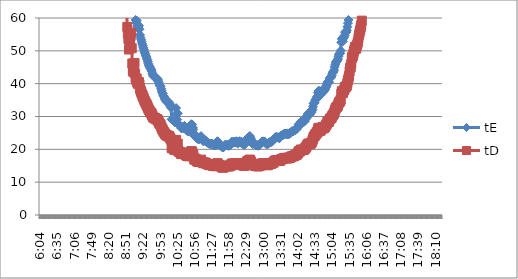
| Category | tE | tD |
|---|---|---|
| 0.25277777777777777 | 17882.69 | 12549.256 |
| 0.2534722222222222 | 17882.69 | 12549.256 |
| 0.25416666666666665 | 17882.69 | 12549.256 |
| 0.2548611111111111 | 17882.69 | 12549.256 |
| 0.2555555555555556 | 17882.69 | 12549.256 |
| 0.25625000000000003 | 17882.69 | 12549.256 |
| 0.2569444444444445 | 17882.69 | 12549.256 |
| 0.2576388888888889 | 17882.69 | 12549.256 |
| 0.25833333333333336 | 17882.69 | 12549.256 |
| 0.2590277777777778 | 17882.69 | 12549.256 |
| 0.25972222222222224 | 17882.69 | 12549.256 |
| 0.2604166666666667 | 17882.69 | 12549.256 |
| 0.2611111111111111 | 8941.345 | 6274.628 |
| 0.26180555555555557 | 8941.345 | 6274.628 |
| 0.2625 | 8941.345 | 6274.628 |
| 0.26319444444444445 | 8941.345 | 6274.628 |
| 0.2638888888888889 | 8941.345 | 6274.628 |
| 0.26458333333333334 | 8941.345 | 6274.628 |
| 0.2652777777777778 | 8941.345 | 6274.628 |
| 0.2659722222222222 | 8941.345 | 6274.628 |
| 0.26666666666666666 | 5960.897 | 4183.085 |
| 0.2673611111111111 | 5960.897 | 4183.085 |
| 0.26805555555555555 | 5960.897 | 4183.085 |
| 0.26875 | 5960.897 | 4183.085 |
| 0.26944444444444443 | 5960.897 | 4183.085 |
| 0.2701388888888889 | 4470.672 | 3137.314 |
| 0.2708333333333333 | 4470.672 | 3137.314 |
| 0.27152777777777776 | 4470.672 | 3137.314 |
| 0.2722222222222222 | 4470.672 | 3137.314 |
| 0.27291666666666664 | 4470.672 | 3137.314 |
| 0.2736111111111111 | 4470.672 | 3137.314 |
| 0.2743055555555555 | 3576.538 | 2509.851 |
| 0.27499999999999997 | 3576.538 | 2509.851 |
| 0.27569444444444446 | 3576.538 | 2509.851 |
| 0.27638888888888885 | 3576.538 | 2509.851 |
| 0.27708333333333335 | 2980.448 | 2091.543 |
| 0.2777777777777778 | 2980.448 | 2091.543 |
| 0.27847222222222223 | 2554.67 | 1792.751 |
| 0.2791666666666667 | 2554.67 | 1792.751 |
| 0.2798611111111111 | 2554.67 | 1792.751 |
| 0.28055555555555556 | 2235.336 | 1568.657 |
| 0.28125 | 2235.336 | 1568.657 |
| 0.28194444444444444 | 2235.336 | 1568.657 |
| 0.2826388888888889 | 1986.966 | 1394.362 |
| 0.2833333333333333 | 1986.966 | 1394.362 |
| 0.28402777777777777 | 1788.269 | 1254.926 |
| 0.2847222222222222 | 1788.269 | 1254.926 |
| 0.28541666666666665 | 1625.699 | 1140.841 |
| 0.28611111111111115 | 1490.224 | 1045.771 |
| 0.28680555555555554 | 1490.224 | 1045.771 |
| 0.28750000000000003 | 1375.592 | 965.327 |
| 0.2881944444444445 | 1277.335 | 896.375 |
| 0.2888888888888889 | 1192.179 | 836.617 |
| 0.28958333333333336 | 1192.179 | 836.617 |
| 0.2902777777777778 | 1117.668 | 784.328 |
| 0.29097222222222224 | 1051.923 | 738.192 |
| 0.2916666666666667 | 993.483 | 697.181 |
| 0.2923611111111111 | 941.194 | 660.487 |
| 0.29305555555555557 | 941.194 | 660.487 |
| 0.29375 | 894.134 | 627.463 |
| 0.29444444444444445 | 851.557 | 597.584 |
| 0.2951388888888889 | 812.85 | 570.421 |
| 0.29583333333333334 | 777.508 | 545.62 |
| 0.2965277777777778 | 777.508 | 545.62 |
| 0.2972222222222222 | 745.112 | 522.886 |
| 0.29791666666666666 | 715.308 | 501.97 |
| 0.2986111111111111 | 687.796 | 482.664 |
| 0.29930555555555555 | 662.322 | 464.787 |
| 0.3 | 638.667 | 448.188 |
| 0.30277777777777776 | 616.644 | 432.733 |
| 0.3055555555555555 | 596.09 | 418.309 |
| 0.30833333333333335 | 576.861 | 404.815 |
| 0.30972222222222223 | 558.834 | 392.164 |
| 0.3111111111111111 | 541.9 | 380.28 |
| 0.3125 | 510.934 | 358.55 |
| 0.31319444444444444 | 496.741 | 348.59 |
| 0.3138888888888889 | 483.316 | 339.169 |
| 0.3145833333333333 | 470.597 | 330.244 |
| 0.31527777777777777 | 458.531 | 321.776 |
| 0.3159722222222222 | 436.163 | 306.079 |
| 0.31666666666666665 | 425.778 | 298.792 |
| 0.31736111111111115 | 415.877 | 291.843 |
| 0.31805555555555554 | 397.393 | 278.872 |
| 0.31875000000000003 | 380.483 | 267.005 |
| 0.3194444444444445 | 372.556 | 261.443 |
| 0.3201388888888889 | 357.654 | 250.985 |
| 0.32083333333333336 | 357.654 | 250.985 |
| 0.3215277777777778 | 350.641 | 246.064 |
| 0.32222222222222224 | 343.898 | 241.332 |
| 0.3229166666666667 | 331.161 | 232.394 |
| 0.3236111111111111 | 319.334 | 224.094 |
| 0.32430555555555557 | 313.731 | 220.162 |
| 0.325 | 308.322 | 216.366 |
| 0.32569444444444445 | 298.045 | 209.154 |
| 0.3263888888888889 | 283.852 | 199.195 |
| 0.32708333333333334 | 279.417 | 196.082 |
| 0.3277777777777778 | 275.118 | 193.065 |
| 0.3284722222222222 | 262.981 | 184.548 |
| 0.32916666666666666 | 262.981 | 184.548 |
| 0.3298611111111111 | 255.467 | 179.275 |
| 0.33055555555555555 | 251.869 | 176.75 |
| 0.33125 | 244.968 | 171.908 |
| 0.33194444444444443 | 241.658 | 169.585 |
| 0.3326388888888889 | 241.658 | 169.585 |
| 0.3333333333333333 | 241.658 | 169.585 |
| 0.3340277777777778 | 235.299 | 165.122 |
| 0.3347222222222222 | 232.243 | 162.977 |
| 0.3354166666666667 | 229.265 | 160.888 |
| 0.3361111111111111 | 223.534 | 156.866 |
| 0.3368055555555556 | 218.082 | 153.04 |
| 0.33749999999999997 | 215.454 | 151.196 |
| 0.33819444444444446 | 207.938 | 145.922 |
| 0.33888888888888885 | 200.929 | 141.003 |
| 0.33958333333333335 | 184.358 | 129.374 |
| 0.34027777777777773 | 178.827 | 125.493 |
| 0.34097222222222223 | 178.827 | 125.493 |
| 0.3416666666666666 | 170.311 | 119.517 |
| 0.3423611111111111 | 164.061 | 115.131 |
| 0.3430555555555555 | 170.311 | 119.517 |
| 0.34375 | 168.705 | 118.389 |
| 0.3444444444444445 | 167.128 | 117.283 |
| 0.3451388888888889 | 152.844 | 107.259 |
| 0.3458333333333334 | 159.667 | 112.047 |
| 0.34652777777777777 | 159.667 | 112.047 |
| 0.34722222222222227 | 159.667 | 112.047 |
| 0.34791666666666665 | 156.866 | 110.081 |
| 0.34861111111111115 | 154.161 | 108.183 |
| 0.34930555555555554 | 151.548 | 106.35 |
| 0.35000000000000003 | 147.791 | 103.713 |
| 0.3506944444444444 | 137.559 | 96.533 |
| 0.3513888888888889 | 129.585 | 90.937 |
| 0.3520833333333333 | 126.828 | 89.002 |
| 0.3527777777777778 | 133.453 | 93.651 |
| 0.3534722222222222 | 130.531 | 91.6 |
| 0.3541666666666667 | 135.475 | 95.07 |
| 0.3548611111111111 | 135.475 | 95.07 |
| 0.35555555555555557 | 132.464 | 92.957 |
| 0.35625 | 129.585 | 90.937 |
| 0.35694444444444445 | 123.329 | 86.547 |
| 0.3576388888888889 | 115.372 | 80.963 |
| 0.35833333333333334 | 114.633 | 80.444 |
| 0.3590277777777778 | 109.71 | 76.989 |
| 0.3597222222222222 | 103.969 | 72.961 |
| 0.36041666666666666 | 99.903 | 70.108 |
| 0.3611111111111111 | 97.72 | 68.575 |
| 0.36180555555555555 | 98.799 | 69.333 |
| 0.3625 | 95.121 | 66.751 |
| 0.36319444444444443 | 98.257 | 68.952 |
| 0.3638888888888889 | 98.799 | 69.333 |
| 0.3645833333333333 | 98.799 | 69.333 |
| 0.3652777777777778 | 98.799 | 69.333 |
| 0.3659722222222222 | 99.903 | 70.108 |
| 0.3666666666666667 | 97.72 | 68.575 |
| 0.3673611111111111 | 94.617 | 66.398 |
| 0.3680555555555556 | 90.317 | 63.38 |
| 0.36874999999999997 | 88.969 | 62.434 |
| 0.36944444444444446 | 86.39 | 60.624 |
| 0.37013888888888885 | 81.656 | 57.303 |
| 0.37083333333333335 | 78.778 | 55.283 |
| 0.37152777777777773 | 76.422 | 53.629 |
| 0.37222222222222223 | 71.818 | 50.399 |
| 0.3729166666666666 | 74.823 | 52.507 |
| 0.3736111111111111 | 74.511 | 52.289 |
| 0.3743055555555555 | 77.751 | 54.562 |
| 0.375 | 79.127 | 55.528 |
| 0.3756944444444445 | 72.4 | 50.807 |
| 0.3763888888888889 | 65.745 | 46.137 |
| 0.3770833333333334 | 62.527 | 43.879 |
| 0.37777777777777777 | 62.093 | 43.574 |
| 0.37847222222222227 | 62.309 | 43.726 |
| 0.37916666666666665 | 65.988 | 46.307 |
| 0.37986111111111115 | 61.453 | 43.125 |
| 0.38055555555555554 | 59.411 | 41.692 |
| 0.38125000000000003 | 58.632 | 41.145 |
| 0.3819444444444444 | 59.214 | 41.554 |
| 0.3826388888888889 | 57.501 | 40.351 |
| 0.3833333333333333 | 56.951 | 39.966 |
| 0.3840277777777778 | 57.316 | 40.222 |
| 0.3847222222222222 | 57.686 | 40.481 |
| 0.3854166666666667 | 56.591 | 39.713 |
| 0.3861111111111111 | 54.855 | 38.495 |
| 0.38680555555555557 | 54.026 | 37.913 |
| 0.3875 | 53.381 | 37.46 |
| 0.38819444444444445 | 52.751 | 37.018 |
| 0.3888888888888889 | 52.136 | 36.587 |
| 0.38958333333333334 | 51.535 | 36.165 |
| 0.3902777777777778 | 50.948 | 35.753 |
| 0.3909722222222222 | 50.374 | 35.35 |
| 0.39166666666666666 | 49.674 | 34.859 |
| 0.3923611111111111 | 49.264 | 34.571 |
| 0.39305555555555555 | 48.727 | 34.194 |
| 0.39375 | 48.332 | 33.917 |
| 0.39444444444444443 | 47.815 | 33.554 |
| 0.3951388888888889 | 47.309 | 33.199 |
| 0.3958333333333333 | 46.691 | 32.766 |
| 0.3965277777777778 | 46.089 | 32.343 |
| 0.3972222222222222 | 45.619 | 32.013 |
| 0.3979166666666667 | 45.273 | 31.77 |
| 0.3986111111111111 | 44.819 | 31.452 |
| 0.3993055555555556 | 44.595 | 31.295 |
| 0.39999999999999997 | 44.264 | 31.063 |
| 0.40069444444444446 | 43.83 | 30.758 |
| 0.40138888888888885 | 43.195 | 30.312 |
| 0.40208333333333335 | 42.679 | 29.95 |
| 0.40277777777777773 | 42.276 | 29.667 |
| 0.40347222222222223 | 42.276 | 29.667 |
| 0.4041666666666666 | 42.077 | 29.528 |
| 0.4048611111111111 | 41.88 | 29.389 |
| 0.4055555555555555 | 41.978 | 29.458 |
| 0.40625 | 41.491 | 29.117 |
| 0.4069444444444445 | 41.588 | 29.184 |
| 0.4076388888888889 | 41.588 | 29.184 |
| 0.4083333333333334 | 41.204 | 28.915 |
| 0.40902777777777777 | 40.735 | 28.586 |
| 0.40972222222222227 | 40.186 | 28.201 |
| 0.41041666666666665 | 39.563 | 27.764 |
| 0.41111111111111115 | 39.389 | 27.642 |
| 0.41180555555555554 | 39.216 | 27.52 |
| 0.41250000000000003 | 38.457 | 26.988 |
| 0.4131944444444444 | 37.807 | 26.531 |
| 0.4138888888888889 | 37.256 | 26.144 |
| 0.4145833333333333 | 36.948 | 25.928 |
| 0.4152777777777778 | 36.347 | 25.507 |
| 0.4159722222222222 | 36.054 | 25.301 |
| 0.4173611111111111 | 35.623 | 24.999 |
| 0.41805555555555557 | 35.272 | 24.752 |
| 0.41875 | 34.995 | 24.558 |
| 0.41944444444444445 | 34.724 | 24.367 |
| 0.4201388888888889 | 34.523 | 24.226 |
| 0.42083333333333334 | 34.523 | 24.226 |
| 0.4215277777777778 | 34.193 | 23.995 |
| 0.4222222222222222 | 34.193 | 23.995 |
| 0.42291666666666666 | 34.39 | 24.133 |
| 0.4236111111111111 | 33.998 | 23.858 |
| 0.42430555555555555 | 33.551 | 23.545 |
| 0.425 | 33.055 | 23.196 |
| 0.42569444444444443 | 32.633 | 22.9 |
| 0.4263888888888889 | 29.125 | 20.439 |
| 0.4270833333333333 | 29.03 | 20.372 |
| 0.4277777777777778 | 29.316 | 20.573 |
| 0.4284722222222222 | 28.89 | 20.273 |
| 0.4291666666666667 | 28.521 | 20.015 |
| 0.4298611111111111 | 28.43 | 19.951 |
| 0.4305555555555556 | 28.206 | 19.794 |
| 0.43124999999999997 | 28.983 | 20.339 |
| 0.43194444444444446 | 32.573 | 22.858 |
| 0.43263888888888885 | 30.939 | 21.712 |
| 0.43333333333333335 | 29.078 | 20.405 |
| 0.43402777777777773 | 30.939 | 21.712 |
| 0.43472222222222223 | 27.725 | 19.456 |
| 0.4354166666666666 | 27.554 | 19.336 |
| 0.4361111111111111 | 27.344 | 19.188 |
| 0.4368055555555555 | 27.177 | 19.072 |
| 0.4375 | 27.136 | 19.043 |
| 0.4381944444444445 | 26.532 | 18.619 |
| 0.4388888888888889 | 26.415 | 18.537 |
| 0.4395833333333334 | 26.493 | 18.591 |
| 0.44027777777777777 | 26.811 | 18.814 |
| 0.44097222222222227 | 26.493 | 18.591 |
| 0.44166666666666665 | 26.493 | 18.591 |
| 0.44236111111111115 | 27.136 | 19.043 |
| 0.44305555555555554 | 26.337 | 18.482 |
| 0.44375000000000003 | 26.376 | 18.509 |
| 0.4444444444444444 | 25.992 | 18.24 |
| 0.4451388888888889 | 25.805 | 18.109 |
| 0.4458333333333333 | 25.62 | 17.979 |
| 0.4465277777777778 | 25.62 | 17.979 |
| 0.4472222222222222 | 25.547 | 17.928 |
| 0.4479166666666667 | 25.547 | 17.928 |
| 0.4486111111111111 | 25.547 | 17.928 |
| 0.44930555555555557 | 26.183 | 18.374 |
| 0.45 | 26.972 | 18.928 |
| 0.45069444444444445 | 27.597 | 19.366 |
| 0.4513888888888889 | 27.639 | 19.396 |
| 0.45208333333333334 | 27.554 | 19.336 |
| 0.4527777777777778 | 26.651 | 18.702 |
| 0.4534722222222222 | 26.068 | 18.293 |
| 0.45416666666666666 | 24.872 | 17.454 |
| 0.4548611111111111 | 24.101 | 16.913 |
| 0.45555555555555555 | 24.068 | 16.89 |
| 0.45625 | 24.363 | 17.097 |
| 0.45694444444444443 | 24.133 | 16.936 |
| 0.4576388888888889 | 23.437 | 16.447 |
| 0.4583333333333333 | 23.315 | 16.361 |
| 0.4590277777777778 | 23.254 | 16.319 |
| 0.4597222222222222 | 23.074 | 16.193 |
| 0.4604166666666667 | 23.015 | 16.151 |
| 0.4611111111111111 | 23.194 | 16.277 |
| 0.4618055555555556 | 23.407 | 16.426 |
| 0.46249999999999997 | 23.686 | 16.622 |
| 0.46319444444444446 | 24.036 | 16.867 |
| 0.46388888888888885 | 23.194 | 16.277 |
| 0.46458333333333335 | 22.897 | 16.068 |
| 0.46527777777777773 | 22.868 | 16.048 |
| 0.46597222222222223 | 22.494 | 15.785 |
| 0.4666666666666666 | 22.466 | 15.765 |
| 0.4673611111111111 | 22.752 | 15.966 |
| 0.4680555555555555 | 22.752 | 15.966 |
| 0.46875 | 22.665 | 15.905 |
| 0.4694444444444445 | 22.551 | 15.825 |
| 0.4701388888888889 | 22.325 | 15.667 |
| 0.4708333333333334 | 22.132 | 15.531 |
| 0.47152777777777777 | 21.996 | 15.436 |
| 0.47222222222222227 | 21.942 | 15.398 |
| 0.47291666666666665 | 21.861 | 15.341 |
| 0.47361111111111115 | 21.702 | 15.23 |
| 0.47430555555555554 | 21.65 | 15.193 |
| 0.47500000000000003 | 21.65 | 15.193 |
| 0.4756944444444444 | 21.65 | 15.193 |
| 0.4763888888888889 | 21.676 | 15.211 |
| 0.4770833333333333 | 21.755 | 15.267 |
| 0.4777777777777778 | 21.571 | 15.138 |
| 0.4784722222222222 | 21.264 | 14.922 |
| 0.4791666666666667 | 21.34 | 14.975 |
| 0.4798611111111111 | 21.264 | 14.922 |
| 0.48055555555555557 | 21.213 | 14.886 |
| 0.48125 | 21.188 | 14.869 |
| 0.48194444444444445 | 21.264 | 14.922 |
| 0.4826388888888889 | 21.729 | 15.248 |
| 0.48333333333333334 | 22.381 | 15.706 |
| 0.4840277777777778 | 22.466 | 15.765 |
| 0.4847222222222222 | 21.861 | 15.341 |
| 0.48541666666666666 | 21.519 | 15.101 |
| 0.4861111111111111 | 21.519 | 15.101 |
| 0.48680555555555555 | 21.264 | 14.922 |
| 0.4875 | 21.365 | 14.993 |
| 0.48819444444444443 | 21.063 | 14.781 |
| 0.4888888888888889 | 21.038 | 14.764 |
| 0.4895833333333333 | 20.746 | 14.558 |
| 0.4902777777777778 | 20.578 | 14.441 |
| 0.4909722222222222 | 20.578 | 14.441 |
| 0.4916666666666667 | 20.722 | 14.541 |
| 0.4923611111111111 | 21.014 | 14.746 |
| 0.4930555555555556 | 21.34 | 14.975 |
| 0.49374999999999997 | 21.314 | 14.957 |
| 0.49444444444444446 | 21.289 | 14.94 |
| 0.49513888888888885 | 21.188 | 14.869 |
| 0.49583333333333335 | 21.238 | 14.904 |
| 0.49652777777777773 | 21.468 | 15.065 |
| 0.49722222222222223 | 21.163 | 14.851 |
| 0.4979166666666666 | 21.063 | 14.781 |
| 0.4986111111111111 | 21.188 | 14.869 |
| 0.4993055555555555 | 21.314 | 14.957 |
| 0.5 | 21.34 | 14.975 |
| 0.5006944444444444 | 21.755 | 15.267 |
| 0.5013888888888889 | 22.27 | 15.628 |
| 0.5020833333333333 | 22.187 | 15.57 |
| 0.5027777777777778 | 21.835 | 15.323 |
| 0.5034722222222222 | 22.27 | 15.628 |
| 0.5041666666666667 | 22.381 | 15.706 |
| 0.5048611111111111 | 22.077 | 15.493 |
| 0.5055555555555555 | 22.242 | 15.609 |
| 0.50625 | 22.132 | 15.531 |
| 0.5069444444444444 | 22.215 | 15.589 |
| 0.5076388888888889 | 22.466 | 15.765 |
| 0.5083333333333333 | 22.215 | 15.589 |
| 0.5090277777777777 | 21.808 | 15.304 |
| 0.5097222222222222 | 21.888 | 15.36 |
| 0.5104166666666666 | 22.242 | 15.609 |
| 0.5111111111111112 | 22.215 | 15.589 |
| 0.5118055555555555 | 22.494 | 15.785 |
| 0.5125000000000001 | 22.077 | 15.493 |
| 0.5131944444444444 | 22.023 | 15.455 |
| 0.513888888888889 | 22.215 | 15.589 |
| 0.5145833333333333 | 22.159 | 15.551 |
| 0.5152777777777778 | 21.996 | 15.436 |
| 0.5159722222222222 | 21.545 | 15.12 |
| 0.5166666666666667 | 21.442 | 15.047 |
| 0.517361111111111 | 21.365 | 14.993 |
| 0.5180555555555556 | 21.519 | 15.101 |
| 0.5187499999999999 | 21.915 | 15.379 |
| 0.5194444444444445 | 22.27 | 15.628 |
| 0.5201388888888888 | 22.608 | 15.865 |
| 0.5208333333333334 | 23.285 | 16.34 |
| 0.5215277777777778 | 23.224 | 16.298 |
| 0.5222222222222223 | 23.254 | 16.319 |
| 0.5229166666666667 | 23.686 | 16.622 |
| 0.5236111111111111 | 23.686 | 16.622 |
| 0.5243055555555556 | 24.068 | 16.89 |
| 0.525 | 23.623 | 16.578 |
| 0.5256944444444445 | 23.104 | 16.214 |
| 0.5263888888888889 | 22.723 | 15.946 |
| 0.5270833333333333 | 22.132 | 15.531 |
| 0.5277777777777778 | 21.624 | 15.174 |
| 0.5284722222222222 | 21.755 | 15.267 |
| 0.5291666666666667 | 22.023 | 15.455 |
| 0.5298611111111111 | 21.915 | 15.379 |
| 0.5305555555555556 | 21.494 | 15.083 |
| 0.53125 | 21.314 | 14.957 |
| 0.5319444444444444 | 21.264 | 14.922 |
| 0.5326388888888889 | 21.365 | 14.993 |
| 0.5333333333333333 | 21.213 | 14.886 |
| 0.5340277777777778 | 21.238 | 14.904 |
| 0.5347222222222222 | 21.088 | 14.799 |
| 0.5354166666666667 | 21.213 | 14.886 |
| 0.5361111111111111 | 21.365 | 14.993 |
| 0.5368055555555555 | 21.365 | 14.993 |
| 0.5375 | 21.597 | 15.156 |
| 0.5381944444444444 | 21.729 | 15.248 |
| 0.5388888888888889 | 22.187 | 15.57 |
| 0.5395833333333333 | 22.298 | 15.647 |
| 0.5402777777777777 | 22.353 | 15.687 |
| 0.5409722222222222 | 22.409 | 15.726 |
| 0.5416666666666666 | 22.438 | 15.746 |
| 0.5423611111111112 | 22.27 | 15.628 |
| 0.5430555555555555 | 22.325 | 15.667 |
| 0.5437500000000001 | 22.023 | 15.455 |
| 0.5444444444444444 | 21.729 | 15.248 |
| 0.545138888888889 | 21.702 | 15.23 |
| 0.5458333333333333 | 21.624 | 15.174 |
| 0.5465277777777778 | 21.65 | 15.193 |
| 0.5472222222222222 | 21.676 | 15.211 |
| 0.5479166666666667 | 21.861 | 15.341 |
| 0.548611111111111 | 22.105 | 15.512 |
| 0.5493055555555556 | 22.187 | 15.57 |
| 0.5499999999999999 | 22.132 | 15.531 |
| 0.5506944444444445 | 22.159 | 15.551 |
| 0.5513888888888888 | 22.298 | 15.647 |
| 0.5520833333333334 | 22.494 | 15.785 |
| 0.5527777777777778 | 22.551 | 15.825 |
| 0.5534722222222223 | 22.636 | 15.885 |
| 0.5541666666666667 | 23.074 | 16.193 |
| 0.5548611111111111 | 23.254 | 16.319 |
| 0.5555555555555556 | 23.376 | 16.404 |
| 0.55625 | 23.654 | 16.6 |
| 0.5569444444444445 | 23.654 | 16.6 |
| 0.5576388888888889 | 23.812 | 16.71 |
| 0.5583333333333333 | 23.654 | 16.6 |
| 0.5590277777777778 | 23.654 | 16.6 |
| 0.5597222222222222 | 23.654 | 16.6 |
| 0.5604166666666667 | 23.499 | 16.49 |
| 0.5611111111111111 | 23.437 | 16.447 |
| 0.5618055555555556 | 23.468 | 16.469 |
| 0.5625 | 23.749 | 16.666 |
| 0.5631944444444444 | 24.068 | 16.89 |
| 0.5638888888888889 | 24.231 | 17.004 |
| 0.5645833333333333 | 24.231 | 17.004 |
| 0.5652777777777778 | 24.33 | 17.074 |
| 0.5659722222222222 | 24.363 | 17.097 |
| 0.5666666666666667 | 24.564 | 17.238 |
| 0.5673611111111111 | 24.734 | 17.357 |
| 0.5680555555555555 | 24.734 | 17.357 |
| 0.56875 | 24.803 | 17.405 |
| 0.5694444444444444 | 24.7 | 17.333 |
| 0.5701388888888889 | 24.598 | 17.262 |
| 0.5708333333333333 | 24.632 | 17.285 |
| 0.5715277777777777 | 24.872 | 17.454 |
| 0.5722222222222222 | 24.598 | 17.262 |
| 0.5729166666666666 | 24.734 | 17.357 |
| 0.5736111111111112 | 24.666 | 17.309 |
| 0.5743055555555555 | 24.941 | 17.502 |
| 0.5750000000000001 | 25.046 | 17.576 |
| 0.5756944444444444 | 25.011 | 17.551 |
| 0.576388888888889 | 25.294 | 17.75 |
| 0.5770833333333333 | 25.51 | 17.902 |
| 0.5777777777777778 | 25.51 | 17.902 |
| 0.5784722222222222 | 25.474 | 17.876 |
| 0.5791666666666667 | 25.547 | 17.928 |
| 0.579861111111111 | 25.694 | 18.031 |
| 0.5805555555555556 | 25.842 | 18.135 |
| 0.5812499999999999 | 25.955 | 18.214 |
| 0.5819444444444445 | 26.03 | 18.267 |
| 0.5826388888888888 | 26.259 | 18.428 |
| 0.5833333333333334 | 26.221 | 18.401 |
| 0.5840277777777778 | 26.651 | 18.702 |
| 0.5847222222222223 | 26.811 | 18.814 |
| 0.5854166666666667 | 27.512 | 19.307 |
| 0.5861111111111111 | 27.725 | 19.456 |
| 0.5868055555555556 | 27.554 | 19.336 |
| 0.5875 | 27.725 | 19.456 |
| 0.5881944444444445 | 28.43 | 19.951 |
| 0.5888888888888889 | 28.206 | 19.794 |
| 0.5895833333333333 | 28.206 | 19.794 |
| 0.5902777777777778 | 28.251 | 19.825 |
| 0.5909722222222222 | 28.34 | 19.888 |
| 0.5916666666666667 | 28.34 | 19.888 |
| 0.5923611111111111 | 28.43 | 19.951 |
| 0.5930555555555556 | 28.567 | 20.047 |
| 0.59375 | 29.03 | 20.372 |
| 0.5944444444444444 | 29.268 | 20.539 |
| 0.5951388888888889 | 29.607 | 20.777 |
| 0.5958333333333333 | 30.156 | 21.162 |
| 0.5965277777777778 | 30.413 | 21.342 |
| 0.5972222222222222 | 30.832 | 21.637 |
| 0.5979166666666667 | 30.993 | 21.749 |
| 0.5986111111111111 | 30.939 | 21.712 |
| 0.5993055555555555 | 30.674 | 21.525 |
| 0.6 | 30.779 | 21.599 |
| 0.6006944444444444 | 31.1 | 21.825 |
| 0.6013888888888889 | 31.263 | 21.939 |
| 0.6020833333333333 | 31.707 | 22.25 |
| 0.6027777777777777 | 32.163 | 22.571 |
| 0.6034722222222222 | 32.994 | 23.154 |
| 0.6041666666666666 | 33.933 | 23.813 |
| 0.6048611111111112 | 34.062 | 23.903 |
| 0.6055555555555555 | 34.324 | 24.087 |
| 0.6062500000000001 | 34.995 | 24.558 |
| 0.6069444444444444 | 35.064 | 24.606 |
| 0.607638888888889 | 35.411 | 24.85 |
| 0.6083333333333333 | 36.054 | 25.301 |
| 0.6090277777777778 | 35.765 | 25.099 |
| 0.6097222222222222 | 37.256 | 26.144 |
| 0.6104166666666667 | 37.807 | 26.531 |
| 0.611111111111111 | 37.807 | 26.531 |
| 0.6118055555555556 | 37.333 | 26.199 |
| 0.6124999999999999 | 36.495 | 25.611 |
| 0.6131944444444445 | 36.796 | 25.822 |
| 0.6138888888888888 | 37.333 | 26.199 |
| 0.6145833333333334 | 37.727 | 26.475 |
| 0.6152777777777778 | 38.129 | 26.757 |
| 0.6159722222222223 | 37.807 | 26.531 |
| 0.6166666666666667 | 37.569 | 26.364 |
| 0.6173611111111111 | 37.887 | 26.587 |
| 0.6180555555555556 | 38.048 | 26.701 |
| 0.61875 | 38.293 | 26.872 |
| 0.6194444444444445 | 38.875 | 27.281 |
| 0.6201388888888889 | 39.131 | 27.46 |
| 0.6208333333333333 | 39.651 | 27.825 |
| 0.6215277777777778 | 40.459 | 28.392 |
| 0.6222222222222222 | 40.367 | 28.328 |
| 0.6229166666666667 | 40.367 | 28.328 |
| 0.6236111111111111 | 40.55 | 28.456 |
| 0.6243055555555556 | 41.491 | 29.117 |
| 0.625 | 41.88 | 29.389 |
| 0.6256944444444444 | 41.88 | 29.389 |
| 0.6263888888888889 | 42.077 | 29.528 |
| 0.6270833333333333 | 42.578 | 29.879 |
| 0.6277777777777778 | 43.195 | 30.312 |
| 0.6284722222222222 | 43.51 | 30.533 |
| 0.6291666666666667 | 43.616 | 30.608 |
| 0.6298611111111111 | 44.155 | 30.986 |
| 0.6305555555555555 | 45.045 | 31.61 |
| 0.63125 | 45.736 | 32.095 |
| 0.6319444444444444 | 46.328 | 32.511 |
| 0.6326388888888889 | 46.691 | 32.766 |
| 0.6333333333333333 | 46.936 | 32.938 |
| 0.6340277777777777 | 47.06 | 33.024 |
| 0.6347222222222222 | 47.56 | 33.376 |
| 0.6354166666666666 | 48.332 | 33.917 |
| 0.6361111111111112 | 48.86 | 34.288 |
| 0.6368055555555555 | 49.264 | 34.571 |
| 0.6375000000000001 | 49.264 | 34.571 |
| 0.6381944444444444 | 50.092 | 35.152 |
| 0.638888888888889 | 52.596 | 36.91 |
| 0.6395833333333333 | 53.702 | 37.685 |
| 0.6402777777777778 | 53.381 | 37.46 |
| 0.6409722222222222 | 52.907 | 37.128 |
| 0.6416666666666667 | 53.864 | 37.799 |
| 0.642361111111111 | 54.19 | 38.028 |
| 0.6430555555555556 | 54.687 | 38.377 |
| 0.6437499999999999 | 55.709 | 39.094 |
| 0.6444444444444445 | 55.536 | 38.973 |
| 0.6451388888888888 | 55.709 | 39.094 |
| 0.6458333333333334 | 56.235 | 39.463 |
| 0.6465277777777778 | 57.316 | 40.222 |
| 0.6472222222222223 | 58.44 | 41.011 |
| 0.6479166666666667 | 59.411 | 41.692 |
| 0.6486111111111111 | 60.414 | 42.396 |
| 0.6493055555555556 | 62.309 | 43.726 |
| 0.65 | 63.867 | 44.819 |
| 0.6506944444444445 | 64.096 | 44.979 |
| 0.6513888888888889 | 65.504 | 45.968 |
| 0.6520833333333333 | 67.995 | 47.716 |
| 0.6527777777777778 | 68.78 | 48.266 |
| 0.6534722222222222 | 69.045 | 48.453 |
| 0.6541666666666667 | 70.128 | 49.213 |
| 0.6548611111111111 | 71.246 | 49.997 |
| 0.6555555555555556 | 72.108 | 50.602 |
| 0.65625 | 72.991 | 51.221 |
| 0.6569444444444444 | 72.108 | 50.602 |
| 0.6576388888888889 | 72.4 | 50.807 |
| 0.6583333333333333 | 73.591 | 51.643 |
| 0.6590277777777778 | 74.202 | 52.072 |
| 0.6597222222222222 | 75.137 | 52.728 |
| 0.6604166666666667 | 76.75 | 53.859 |
| 0.6611111111111111 | 78.09 | 54.8 |
| 0.6618055555555555 | 79.127 | 55.528 |
| 0.6625 | 80.191 | 56.275 |
| 0.6631944444444444 | 81.285 | 57.042 |
| 0.6638888888888889 | 82.409 | 57.831 |
| 0.6645833333333333 | 84.352 | 59.195 |
| 0.6652777777777777 | 85.974 | 60.333 |
| 0.6659722222222222 | 87.233 | 61.216 |
| 0.6666666666666666 | 88.092 | 61.819 |
| 0.6673611111111111 | 89.863 | 63.062 |
| 0.6680555555555556 | 92.656 | 65.022 |
| 0.6687500000000001 | 95.121 | 66.751 |
| 0.6694444444444444 | 96.663 | 67.834 |
| 0.6701388888888888 | 98.257 | 68.952 |
| 0.6708333333333334 | 99.903 | 70.108 |
| 0.6715277777777778 | 102.774 | 72.122 |
| 0.6722222222222222 | 103.969 | 72.961 |
| 0.6729166666666666 | 106.445 | 74.698 |
| 0.6736111111111112 | 109.71 | 76.989 |
| 0.6743055555555556 | 112.47 | 78.926 |
| 0.6749999999999999 | 115.372 | 80.963 |
| 0.6756944444444444 | 118.428 | 83.108 |
| 0.6763888888888889 | 123.329 | 86.547 |
| 0.6770833333333334 | 127.733 | 89.638 |
| 0.6777777777777777 | 129.585 | 90.937 |
| 0.6784722222222223 | 132.464 | 92.957 |
| 0.6791666666666667 | 134.456 | 94.355 |
| 0.6798611111111111 | 138.626 | 97.281 |
| 0.6805555555555555 | 141.926 | 99.597 |
| 0.68125 | 145.388 | 102.026 |
| 0.6819444444444445 | 151.548 | 106.35 |
| 0.6826388888888889 | 154.161 | 108.183 |
| 0.6833333333333332 | 155.502 | 109.124 |
| 0.6840277777777778 | 158.254 | 111.055 |
| 0.6847222222222222 | 162.57 | 114.084 |
| 0.6854166666666667 | 168.705 | 118.389 |
| 0.686111111111111 | 171.949 | 120.666 |
| 0.6868055555555556 | 175.32 | 123.032 |
| 0.6875 | 178.827 | 125.493 |
| 0.6881944444444444 | 182.476 | 128.054 |
| 0.688888888888889 | 188.239 | 132.097 |
| 0.6895833333333333 | 192.287 | 134.938 |
| 0.6902777777777778 | 196.513 | 137.904 |
| 0.6909722222222222 | 200.929 | 141.003 |
| 0.6916666666666668 | 205.548 | 144.244 |
| 0.6923611111111111 | 210.385 | 147.638 |
| 0.6930555555555555 | 215.454 | 151.196 |
| 0.69375 | 220.774 | 154.929 |
| 0.6944444444444445 | 226.363 | 158.851 |
| 0.6951388888888889 | 232.243 | 162.977 |
| 0.6958333333333333 | 238.436 | 167.323 |
| 0.6965277777777777 | 244.968 | 171.908 |
| 0.6972222222222223 | 248.371 | 174.295 |
| 0.6979166666666666 | 255.467 | 179.275 |
| 0.6986111111111111 | 262.981 | 184.548 |
| 0.6993055555555556 | 266.906 | 187.302 |
| 0.7000000000000001 | 270.95 | 190.14 |
| 0.7006944444444444 | 279.417 | 196.082 |
| 0.7013888888888888 | 283.852 | 199.195 |
| 0.7020833333333334 | 288.43 | 202.407 |
| 0.7027777777777778 | 293.159 | 205.726 |
| 0.7034722222222222 | 303.096 | 212.699 |
| 0.7041666666666666 | 308.322 | 216.366 |
| 0.7048611111111112 | 313.731 | 220.162 |
| 0.7055555555555556 | 325.14 | 228.168 |
| 0.7062499999999999 | 331.161 | 232.394 |
| 0.7069444444444444 | 337.409 | 236.778 |
| 0.7076388888888889 | 350.641 | 246.064 |
| 0.7083333333333334 | 357.654 | 250.985 |
| 0.7090277777777777 | 364.953 | 256.107 |
| 0.7097222222222223 | 380.483 | 267.005 |
| 0.7104166666666667 | 388.754 | 272.81 |
| 0.7111111111111111 | 397.393 | 278.872 |
| 0.7118055555555555 | 406.425 | 285.21 |
| 0.7125 | 415.877 | 291.843 |
| 0.7131944444444445 | 425.778 | 298.792 |
| 0.7138888888888889 | 436.163 | 306.079 |
| 0.7145833333333332 | 447.067 | 313.731 |
| 0.7152777777777778 | 470.597 | 330.244 |
| 0.7159722222222222 | 483.316 | 339.169 |
| 0.7166666666666667 | 496.741 | 348.59 |
| 0.717361111111111 | 510.934 | 358.55 |
| 0.7180555555555556 | 525.961 | 369.096 |
| 0.71875 | 541.9 | 380.28 |
| 0.7194444444444444 | 558.834 | 392.164 |
| 0.720138888888889 | 596.09 | 418.309 |
| 0.7208333333333333 | 616.644 | 432.733 |
| 0.7215277777777778 | 638.667 | 448.188 |
| 0.7222222222222222 | 662.322 | 464.787 |
| 0.7229166666666668 | 687.796 | 482.664 |
| 0.7236111111111111 | 715.308 | 501.97 |
| 0.7243055555555555 | 745.112 | 522.886 |
| 0.725 | 777.508 | 545.62 |
| 0.7256944444444445 | 812.85 | 570.421 |
| 0.7263888888888889 | 851.557 | 597.584 |
| 0.7270833333333333 | 851.557 | 597.584 |
| 0.7277777777777777 | 894.134 | 627.463 |
| 0.7284722222222223 | 941.194 | 660.487 |
| 0.7291666666666666 | 993.483 | 697.181 |
| 0.7298611111111111 | 1051.923 | 738.192 |
| 0.7305555555555556 | 1051.923 | 738.192 |
| 0.7312500000000001 | 1117.668 | 784.328 |
| 0.7319444444444444 | 1192.179 | 836.617 |
| 0.7326388888888888 | 1277.335 | 896.375 |
| 0.7333333333333334 | 1277.335 | 896.375 |
| 0.7340277777777778 | 1375.592 | 965.327 |
| 0.7347222222222222 | 1490.224 | 1045.771 |
| 0.7354166666666666 | 1490.224 | 1045.771 |
| 0.7361111111111112 | 1625.699 | 1140.841 |
| 0.7368055555555556 | 1625.699 | 1140.841 |
| 0.7374999999999999 | 1788.269 | 1254.926 |
| 0.7381944444444444 | 1788.269 | 1254.926 |
| 0.7388888888888889 | 1986.966 | 1394.362 |
| 0.7395833333333334 | 1986.966 | 1394.362 |
| 0.7402777777777777 | 2235.336 | 1568.657 |
| 0.7409722222222223 | 2235.336 | 1568.657 |
| 0.7416666666666667 | 2554.67 | 1792.751 |
| 0.7423611111111111 | 2554.67 | 1792.751 |
| 0.7430555555555555 | 2554.67 | 1792.751 |
| 0.74375 | 2980.448 | 2091.543 |
| 0.7444444444444445 | 2980.448 | 2091.543 |
| 0.7451388888888889 | 2980.448 | 2091.543 |
| 0.7458333333333332 | 3576.538 | 2509.851 |
| 0.7465277777777778 | 3576.538 | 2509.851 |
| 0.7472222222222222 | 3576.538 | 2509.851 |
| 0.7479166666666667 | 3576.538 | 2509.851 |
| 0.748611111111111 | 4470.672 | 3137.314 |
| 0.7493055555555556 | 4470.672 | 3137.314 |
| 0.75 | 4470.672 | 3137.314 |
| 0.7506944444444444 | 5960.897 | 4183.085 |
| 0.751388888888889 | 5960.897 | 4183.085 |
| 0.7520833333333333 | 5960.897 | 4183.085 |
| 0.7527777777777778 | 5960.897 | 4183.085 |
| 0.7534722222222222 | 5960.897 | 4183.085 |
| 0.7541666666666668 | 8941.345 | 6274.628 |
| 0.7548611111111111 | 8941.345 | 6274.628 |
| 0.7555555555555555 | 8941.345 | 6274.628 |
| 0.75625 | 8941.345 | 6274.628 |
| 0.7569444444444445 | 8941.345 | 6274.628 |
| 0.7576388888888889 | 8941.345 | 6274.628 |
| 0.7583333333333333 | 8941.345 | 6274.628 |
| 0.7590277777777777 | 17882.69 | 12549.256 |
| 0.7597222222222223 | 17882.69 | 12549.256 |
| 0.7604166666666666 | 17882.69 | 12549.256 |
| 0.7611111111111111 | 17882.69 | 12549.256 |
| 0.7618055555555556 | 17882.69 | 12549.256 |
| 0.7625000000000001 | 17882.69 | 12549.256 |
| 0.7631944444444444 | 17882.69 | 12549.256 |
| 0.7638888888888888 | 17882.69 | 12549.256 |
| 0.7645833333333334 | 17882.69 | 12549.256 |
| 0.7652777777777778 | 17882.69 | 12549.256 |
| 0.7659722222222222 | 17882.69 | 12549.256 |